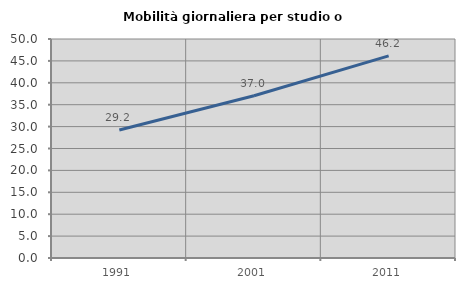
| Category | Mobilità giornaliera per studio o lavoro |
|---|---|
| 1991.0 | 29.231 |
| 2001.0 | 37.037 |
| 2011.0 | 46.154 |